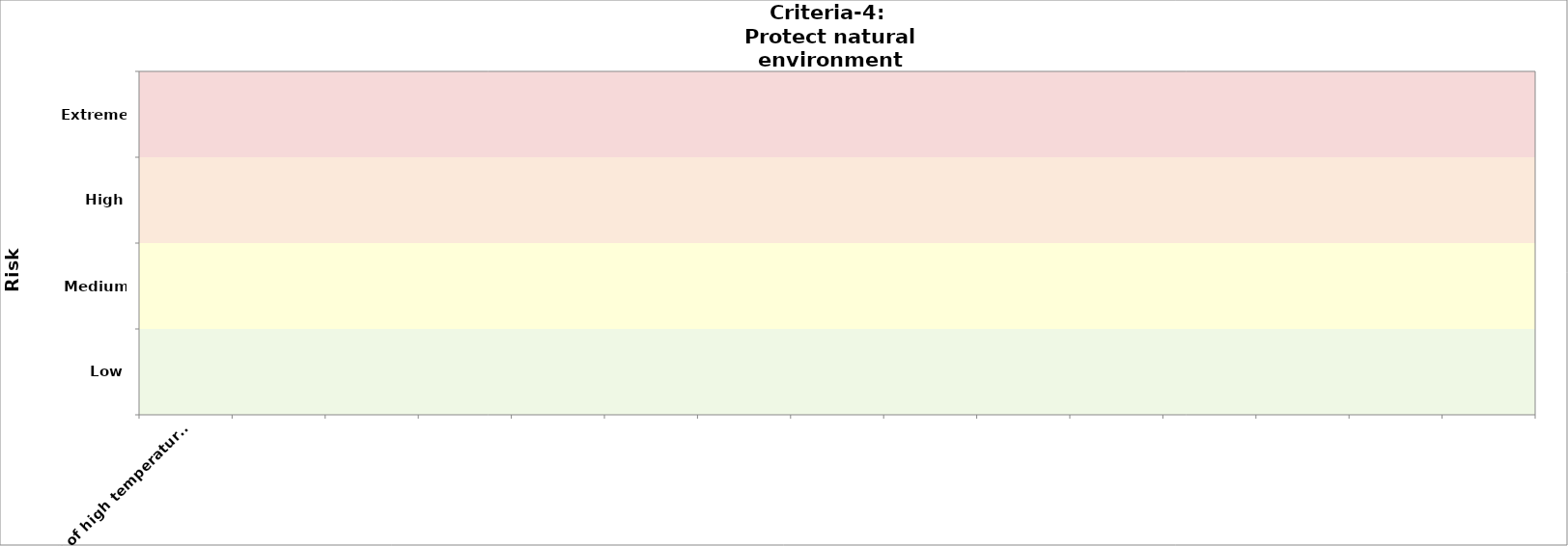
| Category | Criteria-3 (public health) | Criteria-4 
2050 |
|---|---|---|
| e.g. effect of high temperature on road pavement  |  | 0 |